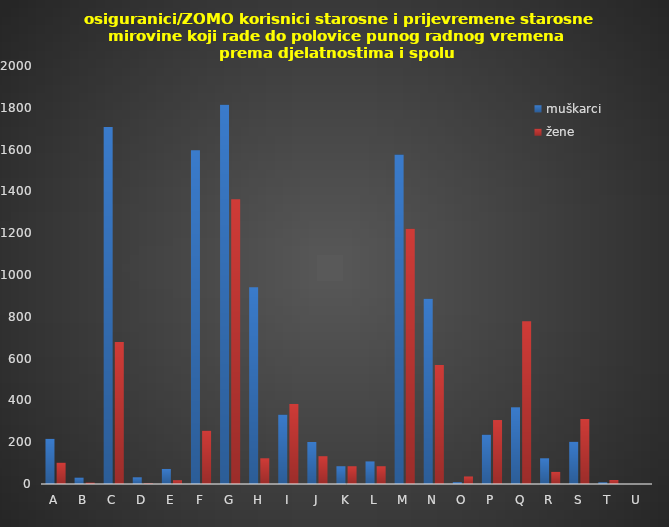
| Category | muškarci | žene |
|---|---|---|
| A | 216 | 102 |
| B | 31 | 7 |
| C | 1708 | 680 |
| D | 32 | 3 |
| E | 72 | 18 |
| F | 1597 | 255 |
| G | 1815 | 1362 |
| H | 941 | 123 |
| I | 332 | 383 |
| J | 201 | 133 |
| K | 85 | 85 |
| L | 108 | 85 |
| M | 1576 | 1221 |
| N | 886 | 569 |
| O | 9 | 36 |
| P | 236 | 306 |
| Q | 367 | 779 |
| R | 123 | 58 |
| S | 202 | 311 |
| T | 8 | 19 |
| U | 0 | 0 |